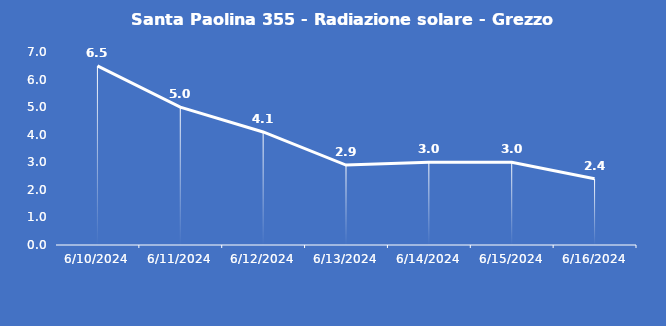
| Category | Santa Paolina 355 - Radiazione solare - Grezzo (W/m2) |
|---|---|
| 6/10/24 | 6.5 |
| 6/11/24 | 5 |
| 6/12/24 | 4.1 |
| 6/13/24 | 2.9 |
| 6/14/24 | 3 |
| 6/15/24 | 3 |
| 6/16/24 | 2.4 |